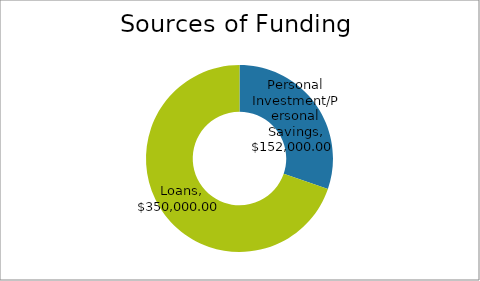
| Category | Sources of Funding |
|---|---|
| Personal Investment/Personal Savings | 152000 |
| Outside Investment | 0 |
| Loans | 350000 |